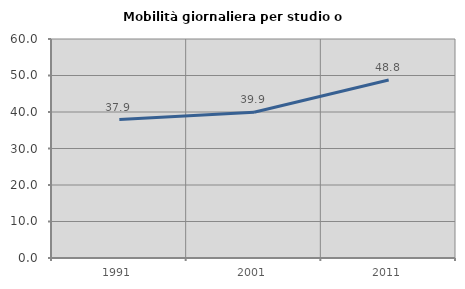
| Category | Mobilità giornaliera per studio o lavoro |
|---|---|
| 1991.0 | 37.94 |
| 2001.0 | 39.946 |
| 2011.0 | 48.758 |